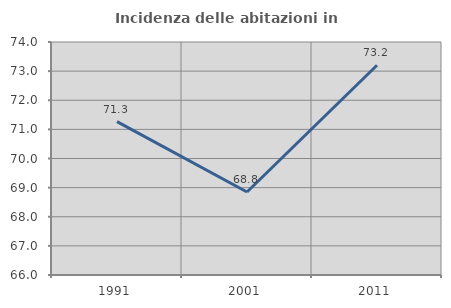
| Category | Incidenza delle abitazioni in proprietà  |
|---|---|
| 1991.0 | 71.266 |
| 2001.0 | 68.849 |
| 2011.0 | 73.2 |